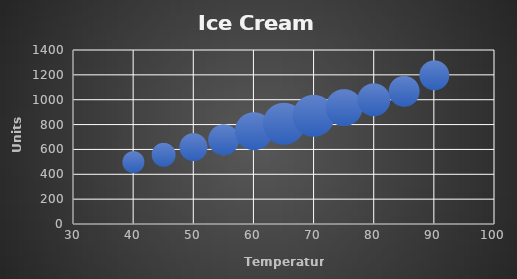
| Category | Units Sold |
|---|---|
| 40.0 | 500 |
| 45.0 | 560 |
| 50.0 | 620 |
| 55.0 | 680 |
| 60.0 | 750 |
| 65.0 | 810 |
| 70.0 | 870 |
| 75.0 | 940 |
| 80.0 | 1000 |
| 85.0 | 1070 |
| 90.0 | 1200 |